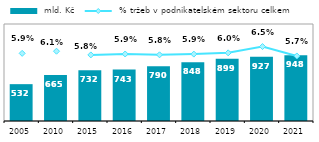
| Category |  mld. Kč |
|---|---|
| 2005.0 | 531.811 |
| 2010.0 | 665.424 |
| 2015.0 | 731.591 |
| 2016.0 | 742.844 |
| 2017.0 | 789.99 |
| 2018.0 | 847.611 |
| 2019.0 | 899.422 |
| 2020.0 | 926.501 |
| 2021.0 | 948.217 |